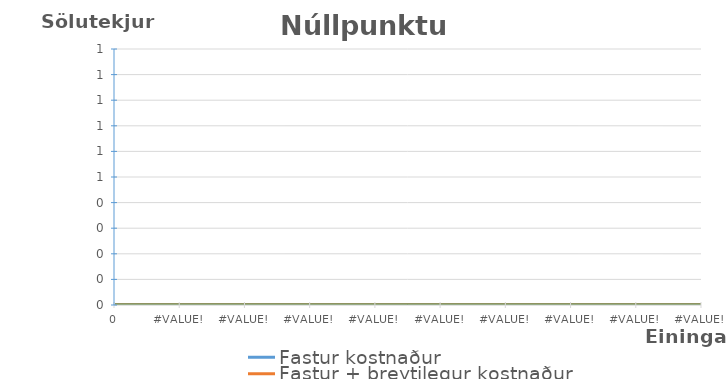
| Category | Fastur kostnaður | Fastur + breytilegur kostnaður | Sölutekjur |
|---|---|---|---|
| 0.0 | 0 | 0 | 0 |
| 0.0 | 0 | 0 | 0 |
| 0.0 | 0 | 0 | 0 |
| 0.0 | 0 | 0 | 0 |
| 0.0 | 0 | 0 | 0 |
| 0.0 | 0 | 0 | 0 |
| 0.0 | 0 | 0 | 0 |
| 0.0 | 0 | 0 | 0 |
| 0.0 | 0 | 0 | 0 |
| 0.0 | 0 | 0 | 0 |